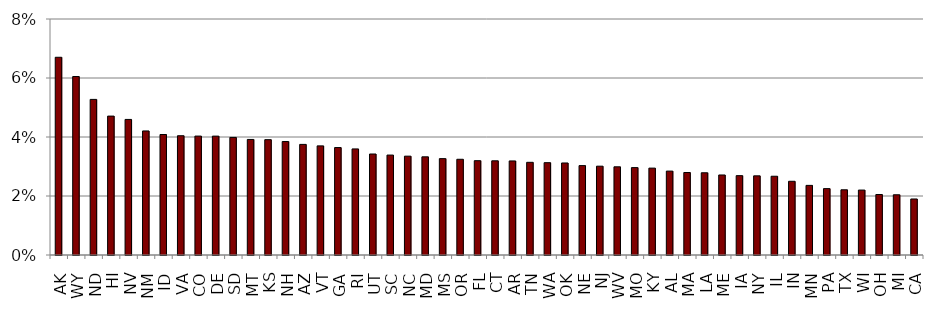
| Category | outmigration_rate |
|---|---|
| AK | 0.067 |
| WY | 0.06 |
| ND | 0.053 |
| HI | 0.047 |
| NV | 0.046 |
| NM | 0.042 |
| ID | 0.041 |
| VA | 0.04 |
| CO | 0.04 |
| DE | 0.04 |
| SD | 0.04 |
| MT | 0.039 |
| KS | 0.039 |
| NH | 0.038 |
| AZ | 0.037 |
| VT | 0.037 |
| GA | 0.036 |
| RI | 0.036 |
| UT | 0.034 |
| SC | 0.034 |
| NC | 0.034 |
| MD | 0.033 |
| MS | 0.033 |
| OR | 0.032 |
| FL | 0.032 |
| CT | 0.032 |
| AR | 0.032 |
| TN | 0.031 |
| WA | 0.031 |
| OK | 0.031 |
| NE | 0.03 |
| NJ | 0.03 |
| WV | 0.03 |
| MO | 0.03 |
| KY | 0.029 |
| AL | 0.028 |
| MA | 0.028 |
| LA | 0.028 |
| ME | 0.027 |
| IA | 0.027 |
| NY | 0.027 |
| IL | 0.027 |
| IN | 0.025 |
| MN | 0.024 |
| PA | 0.023 |
| TX | 0.022 |
| WI | 0.022 |
| OH | 0.021 |
| MI | 0.02 |
| CA | 0.019 |